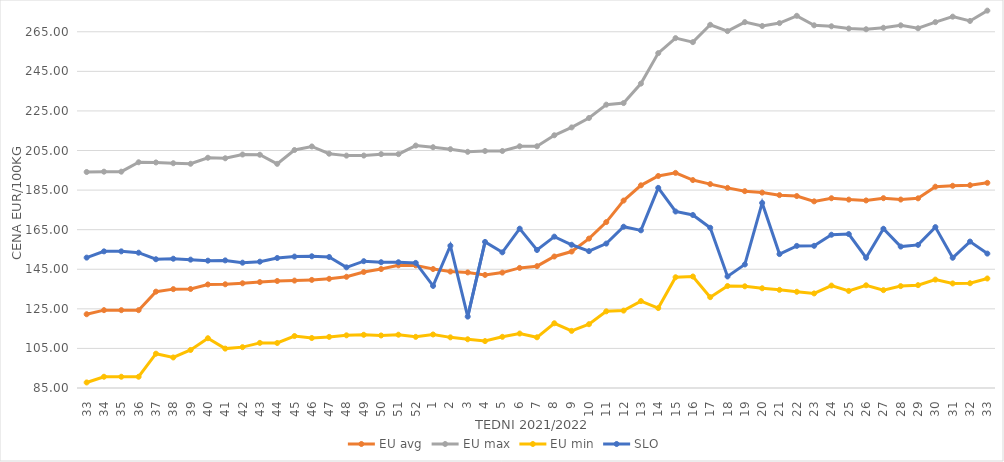
| Category | EU avg | EU max | EU min | SLO |
|---|---|---|---|---|
| 33.0 | 122.274 | 194.145 | 87.8 | 150.88 |
| 34.0 | 124.332 | 194.304 | 90.69 | 154.04 |
| 35.0 | 124.332 | 194.304 | 90.69 | 154.04 |
| 36.0 | 124.332 | 199.06 | 90.69 | 153.37 |
| 37.0 | 133.685 | 198.97 | 102.334 | 150.06 |
| 38.0 | 134.959 | 198.57 | 100.43 | 150.32 |
| 39.0 | 135.021 | 198.3 | 104.21 | 149.86 |
| 40.0 | 137.315 | 201.34 | 110.15 | 149.34 |
| 41.0 | 137.411 | 201.081 | 104.9 | 149.48 |
| 42.0 | 137.908 | 202.98 | 105.65 | 148.32 |
| 43.0 | 138.52 | 202.856 | 107.8 | 148.83 |
| 44.0 | 139.076 | 198.26 | 107.75 | 150.69 |
| 45.0 | 139.275 | 205.257 | 111.25 | 151.41 |
| 46.0 | 139.626 | 207.046 | 110.26 | 151.56 |
| 47.0 | 140.17 | 203.387 | 110.83 | 151.2 |
| 48.0 | 141.2 | 202.42 | 111.62 | 145.97 |
| 49.0 | 143.614 | 202.45 | 111.89 | 149.07 |
| 50.0 | 145.101 | 203.17 | 111.54 | 148.55 |
| 51.0 | 146.984 | 203.17 | 111.93 | 148.54 |
| 52.0 | 146.958 | 207.5 | 110.85 | 148.22 |
| 1.0 | 145.11 | 206.66 | 112.04 | 136.59 |
| 2.0 | 143.822 | 205.67 | 110.59 | 156.88 |
| 3.0 | 143.402 | 204.34 | 109.62 | 121.07 |
| 4.0 | 142.134 | 204.76 | 108.71 | 158.82 |
| 5.0 | 143.314 | 204.76 | 110.86 | 153.55 |
| 6.0 | 145.677 | 207.14 | 112.52 | 165.51 |
| 7.0 | 146.556 | 207.14 | 110.619 | 154.74 |
| 8.0 | 151.439 | 212.7 | 117.709 | 161.48 |
| 9.0 | 153.947 | 216.67 | 113.871 | 157.38 |
| 10.0 | 160.496 | 221.43 | 117.233 | 154.16 |
| 11.0 | 168.845 | 228.17 | 123.737 | 157.96 |
| 12.0 | 179.714 | 228.97 | 124.105 | 166.49 |
| 13.0 | 187.409 | 238.81 | 128.918 | 164.66 |
| 14.0 | 192.137 | 254.21 | 125.399 | 186.11 |
| 15.0 | 193.697 | 261.79 | 140.954 | 174.18 |
| 16.0 | 190.066 | 259.76 | 141.337 | 172.42 |
| 17.0 | 188.031 | 268.52 | 130.897 | 165.96 |
| 18.0 | 186.119 | 265.34 | 136.529 | 141.36 |
| 19.0 | 184.47 | 269.87 | 136.387 | 147.43 |
| 20.0 | 183.734 | 267.92 | 135.392 | 178.51 |
| 21.0 | 182.45 | 269.38 | 134.589 | 152.67 |
| 22.0 | 181.991 | 273.06 | 133.621 | 156.8 |
| 23.0 | 179.308 | 268.27 | 132.787 | 156.84 |
| 24.0 | 180.886 | 267.77 | 136.75 | 162.44 |
| 25.0 | 180.2 | 266.63 | 134.058 | 162.78 |
| 26.0 | 179.77 | 266.27 | 136.895 | 150.82 |
| 27.0 | 180.913 | 267.02 | 134.44 | 165.45 |
| 28.0 | 180.226 | 268.25 | 136.486 | 156.46 |
| 29.0 | 180.834 | 266.77 | 136.97 | 157.31 |
| 30.0 | 186.714 | 269.87 | 139.777 | 166.29 |
| 31.0 | 187.179 | 272.64 | 137.828 | 150.81 |
| 32.0 | 187.472 | 270.47 | 137.934 | 158.99 |
| 33.0 | 188.667 | 275.68 | 140.33 | 152.91 |